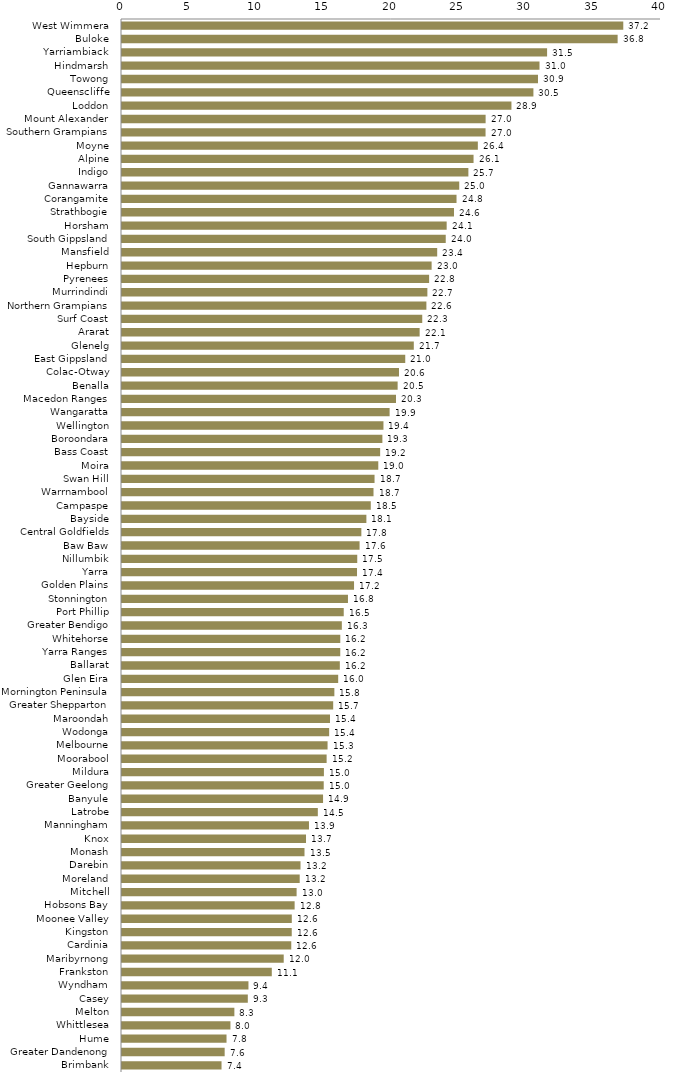
| Category | Series 0 |
|---|---|
| West Wimmera | 37.201 |
| Buloke | 36.782 |
| Yarriambiack | 31.547 |
| Hindmarsh | 30.984 |
| Towong | 30.871 |
| Queenscliffe | 30.531 |
| Loddon | 28.901 |
| Mount Alexander | 26.985 |
| Southern Grampians | 26.98 |
| Moyne | 26.407 |
| Alpine | 26.089 |
| Indigo | 25.705 |
| Gannawarra | 25.027 |
| Corangamite | 24.826 |
| Strathbogie | 24.637 |
| Horsham | 24.094 |
| South Gippsland | 24.025 |
| Mansfield | 23.391 |
| Hepburn | 22.978 |
| Pyrenees | 22.792 |
| Murrindindi | 22.663 |
| Northern Grampians | 22.589 |
| Surf Coast | 22.282 |
| Ararat | 22.089 |
| Glenelg | 21.655 |
| East Gippsland | 21.02 |
| Colac-Otway | 20.556 |
| Benalla | 20.455 |
| Macedon Ranges | 20.334 |
| Wangaratta | 19.86 |
| Wellington | 19.403 |
| Boroondara | 19.324 |
| Bass Coast | 19.157 |
| Moira | 19.02 |
| Swan Hill | 18.742 |
| Warrnambool | 18.665 |
| Campaspe | 18.463 |
| Bayside | 18.136 |
| Central Goldfields | 17.762 |
| Baw Baw | 17.631 |
| Nillumbik | 17.458 |
| Yarra | 17.441 |
| Golden Plains | 17.22 |
| Stonnington | 16.77 |
| Port Phillip | 16.455 |
| Greater Bendigo | 16.315 |
| Whitehorse | 16.199 |
| Yarra Ranges | 16.196 |
| Ballarat | 16.166 |
| Glen Eira | 16.044 |
| Mornington Peninsula | 15.76 |
| Greater Shepparton | 15.673 |
| Maroondah | 15.436 |
| Wodonga | 15.374 |
| Melbourne | 15.255 |
| Moorabool | 15.185 |
| Mildura | 14.984 |
| Greater Geelong | 14.97 |
| Banyule | 14.921 |
| Latrobe | 14.533 |
| Manningham | 13.876 |
| Knox | 13.656 |
| Monash | 13.544 |
| Darebin | 13.248 |
| Moreland | 13.188 |
| Mitchell | 12.958 |
| Hobsons Bay | 12.811 |
| Moonee Valley | 12.601 |
| Kingston | 12.597 |
| Cardinia | 12.562 |
| Maribyrnong | 12.001 |
| Frankston | 11.116 |
| Wyndham | 9.384 |
| Casey | 9.336 |
| Melton | 8.339 |
| Whittlesea | 8.047 |
| Hume | 7.757 |
| Greater Dandenong | 7.619 |
| Brimbank | 7.386 |